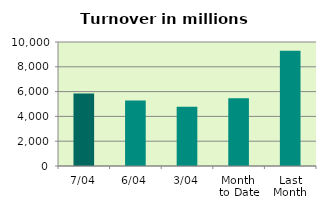
| Category | Series 0 |
|---|---|
| 7/04 | 5846.887 |
| 6/04 | 5289.129 |
| 3/04 | 4781.348 |
| Month 
to Date | 5456.958 |
| Last
Month | 9287.764 |